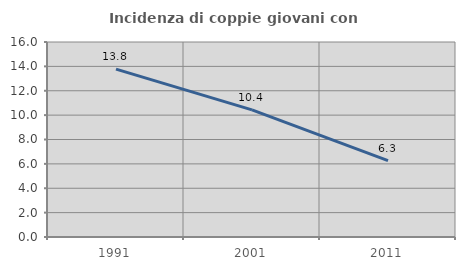
| Category | Incidenza di coppie giovani con figli |
|---|---|
| 1991.0 | 13.777 |
| 2001.0 | 10.428 |
| 2011.0 | 6.271 |